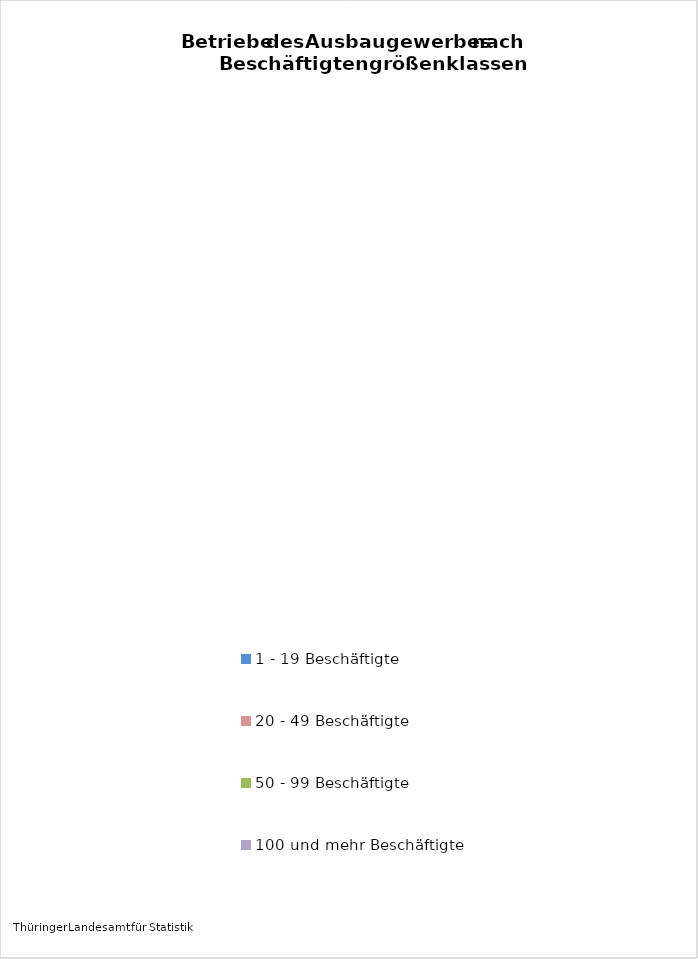
| Category | Anzahl Betriebe 2019 |
|---|---|
| 1 - 19 Beschäftigte | 441 |
| 20 - 49 Beschäftigte | 201 |
| 50 - 99 Beschäftigte | 32 |
| 100 und mehr Beschäftigte | 10 |